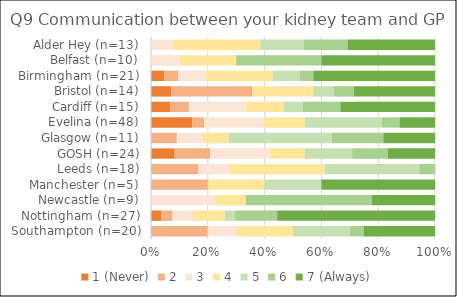
| Category | 1 (Never) | 2 | 3 | 4 | 5 | 6 | 7 (Always) |
|---|---|---|---|---|---|---|---|
| Southampton (n=20) | 0 | 4 | 2 | 4 | 4 | 1 | 5 |
| Nottingham (n=27) | 1 | 1 | 2 | 3 | 1 | 4 | 15 |
| Newcastle (n=9) | 0 | 0 | 2 | 1 | 0 | 4 | 2 |
| Manchester (n=5) | 0 | 1 | 0 | 1 | 1 | 0 | 2 |
| Leeds (n=18) | 0 | 3 | 2 | 6 | 6 | 1 | 0 |
| GOSH (n=24) | 2 | 3 | 5 | 3 | 4 | 3 | 4 |
| Glasgow (n=11) | 0 | 1 | 1 | 1 | 4 | 2 | 2 |
| Evelina (n=48) | 7 | 2 | 10 | 7 | 13 | 3 | 6 |
| Cardiff (n=15) | 1 | 1 | 3 | 2 | 1 | 2 | 5 |
| Bristol (n=14) | 1 | 4 | 0 | 3 | 1 | 1 | 4 |
| Birmingham (n=21) | 1 | 1 | 2 | 5 | 2 | 1 | 9 |
| Belfast (n=10) | 0 | 0 | 1 | 2 | 0 | 3 | 4 |
| Alder Hey (n=13) | 0 | 0 | 1 | 4 | 2 | 2 | 4 |